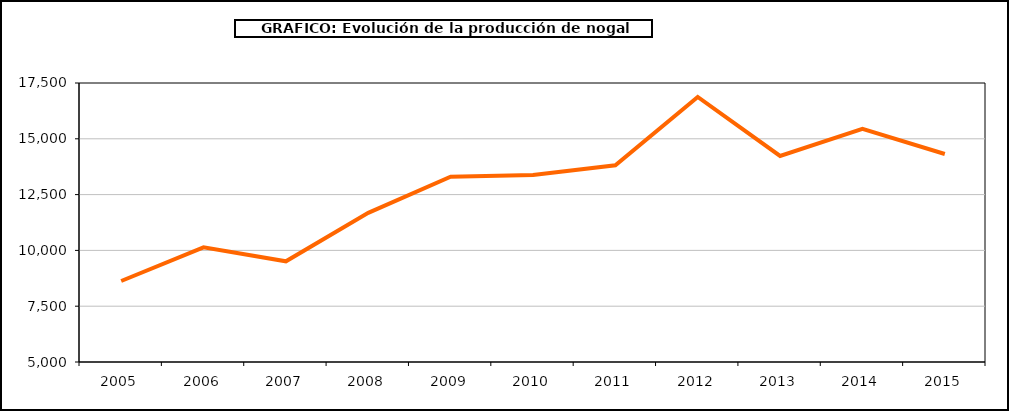
| Category | producción nogal |
|---|---|
| 2005.0 | 8629 |
| 2006.0 | 10140 |
| 2007.0 | 9512 |
| 2008.0 | 11682 |
| 2009.0 | 13299 |
| 2010.0 | 13378 |
| 2011.0 | 13815 |
| 2012.0 | 16877 |
| 2013.0 | 14230 |
| 2014.0 | 15450 |
| 2015.0 | 14319 |